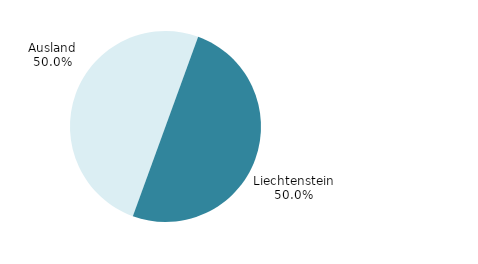
| Category | Series 0 |
|---|---|
| Ausland | 138 |
| Liechtenstein | 138 |